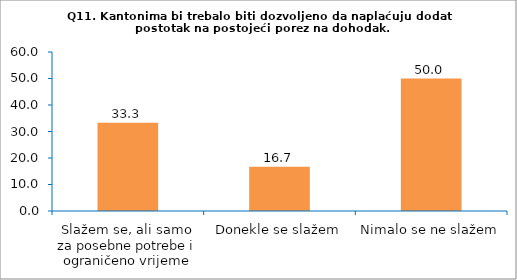
| Category | Series 0 |
|---|---|
| Slažem se, ali samo za posebne potrebe i ograničeno vrijeme | 33.333 |
| Donekle se slažem | 16.667 |
| Nimalo se ne slažem | 50 |